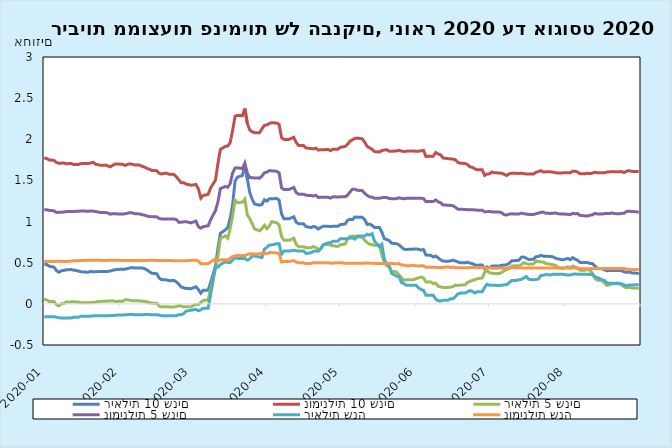
| Category | ריאלית 10 שנים | נומינלית 10 שנים | ריאלית 5 שנים | נומינלית 5 שנים | ריאלית שנה | נומינלית שנה |
|---|---|---|---|---|---|---|
| 2020-01-01 02:00:00 | 0.48 | 1.773 | 0.054 | 1.144 | -0.156 | 0.519 |
| 2020-01-02 02:00:00 | 0.478 | 1.766 | 0.048 | 1.144 | -0.156 | 0.515 |
| 2020-01-03 02:00:00 | 0.458 | 1.749 | 0.03 | 1.136 | -0.156 | 0.515 |
| 2020-01-05 02:00:00 | 0.446 | 1.743 | 0.03 | 1.13 | -0.156 | 0.515 |
| 2020-01-06 02:00:00 | 0.405 | 1.717 | -0.01 | 1.11 | -0.163 | 0.517 |
| 2020-01-07 02:00:00 | 0.384 | 1.708 | -0.024 | 1.113 | -0.168 | 0.517 |
| 2020-01-08 02:00:00 | 0.402 | 1.71 | 0.002 | 1.114 | -0.173 | 0.517 |
| 2020-01-09 02:00:00 | 0.405 | 1.712 | 0.003 | 1.116 | -0.173 | 0.515 |
| 2020-01-10 02:00:00 | 0.414 | 1.703 | 0.024 | 1.121 | -0.171 | 0.515 |
| 2020-01-12 02:00:00 | 0.418 | 1.705 | 0.024 | 1.123 | -0.171 | 0.519 |
| 2020-01-13 02:00:00 | 0.41 | 1.694 | 0.027 | 1.122 | -0.163 | 0.525 |
| 2020-01-14 02:00:00 | 0.406 | 1.695 | 0.023 | 1.126 | -0.163 | 0.525 |
| 2020-01-15 02:00:00 | 0.398 | 1.695 | 0.02 | 1.125 | -0.163 | 0.525 |
| 2020-01-16 02:00:00 | 0.39 | 1.704 | 0.017 | 1.128 | -0.151 | 0.527 |
| 2020-01-17 02:00:00 | 0.387 | 1.707 | 0.012 | 1.128 | -0.151 | 0.527 |
| 2020-01-19 02:00:00 | 0.385 | 1.707 | 0.012 | 1.126 | -0.151 | 0.529 |
| 2020-01-20 02:00:00 | 0.395 | 1.712 | 0.017 | 1.128 | -0.151 | 0.529 |
| 2020-01-21 02:00:00 | 0.389 | 1.721 | 0.017 | 1.126 | -0.146 | 0.531 |
| 2020-01-22 02:00:00 | 0.391 | 1.697 | 0.021 | 1.123 | -0.146 | 0.529 |
| 2020-01-23 02:00:00 | 0.392 | 1.691 | 0.028 | 1.116 | -0.146 | 0.529 |
| 2020-01-24 02:00:00 | 0.392 | 1.684 | 0.03 | 1.109 | -0.146 | 0.529 |
| 2020-01-26 02:00:00 | 0.394 | 1.686 | 0.03 | 1.109 | -0.146 | 0.527 |
| 2020-01-27 02:00:00 | 0.395 | 1.676 | 0.036 | 1.105 | -0.146 | 0.529 |
| 2020-01-28 02:00:00 | 0.4 | 1.665 | 0.035 | 1.09 | -0.14 | 0.531 |
| 2020-01-29 02:00:00 | 0.408 | 1.683 | 0.038 | 1.095 | -0.14 | 0.529 |
| 2020-01-30 02:00:00 | 0.415 | 1.699 | 0.029 | 1.096 | -0.14 | 0.529 |
| 2020-01-31 02:00:00 | 0.418 | 1.699 | 0.031 | 1.092 | -0.135 | 0.529 |
| 2020-02-02 02:00:00 | 0.422 | 1.697 | 0.031 | 1.09 | -0.135 | 0.527 |
| 2020-02-03 02:00:00 | 0.422 | 1.683 | 0.049 | 1.095 | -0.133 | 0.527 |
| 2020-02-04 02:00:00 | 0.427 | 1.694 | 0.049 | 1.1 | -0.133 | 0.527 |
| 2020-02-05 02:00:00 | 0.437 | 1.702 | 0.045 | 1.109 | -0.128 | 0.527 |
| 2020-02-06 02:00:00 | 0.439 | 1.696 | 0.037 | 1.105 | -0.128 | 0.527 |
| 2020-02-07 02:00:00 | 0.436 | 1.689 | 0.037 | 1.097 | -0.133 | 0.527 |
| 2020-02-09 02:00:00 | 0.434 | 1.687 | 0.037 | 1.093 | -0.133 | 0.525 |
| 2020-02-10 02:00:00 | 0.437 | 1.671 | 0.03 | 1.084 | -0.133 | 0.529 |
| 2020-02-11 02:00:00 | 0.428 | 1.662 | 0.031 | 1.078 | -0.131 | 0.527 |
| 2020-02-12 02:00:00 | 0.413 | 1.645 | 0.025 | 1.067 | -0.131 | 0.527 |
| 2020-02-13 02:00:00 | 0.391 | 1.635 | 0.015 | 1.061 | -0.131 | 0.529 |
| 2020-02-14 02:00:00 | 0.372 | 1.621 | 0.008 | 1.06 | -0.133 | 0.529 |
| 2020-02-16 02:00:00 | 0.366 | 1.619 | 0.008 | 1.058 | -0.133 | 0.527 |
| 2020-02-17 02:00:00 | 0.314 | 1.586 | -0.028 | 1.038 | -0.136 | 0.527 |
| 2020-02-18 02:00:00 | 0.292 | 1.578 | -0.038 | 1.031 | -0.146 | 0.527 |
| 2020-02-19 02:00:00 | 0.294 | 1.586 | -0.035 | 1.03 | -0.146 | 0.525 |
| 2020-02-20 02:00:00 | 0.291 | 1.587 | -0.034 | 1.03 | -0.146 | 0.527 |
| 2020-02-21 02:00:00 | 0.282 | 1.575 | -0.037 | 1.031 | -0.143 | 0.527 |
| 2020-02-23 02:00:00 | 0.284 | 1.573 | -0.037 | 1.031 | -0.143 | 0.525 |
| 2020-02-24 02:00:00 | 0.268 | 1.544 | -0.033 | 1.024 | -0.143 | 0.525 |
| 2020-02-25 02:00:00 | 0.239 | 1.508 | -0.023 | 0.992 | -0.132 | 0.525 |
| 2020-02-26 02:00:00 | 0.204 | 1.471 | -0.027 | 0.992 | -0.132 | 0.525 |
| 2020-02-27 02:00:00 | 0.196 | 1.473 | -0.038 | 0.996 | -0.119 | 0.525 |
| 2020-02-28 02:00:00 | 0.187 | 1.456 | -0.034 | 0.998 | -0.089 | 0.525 |
| 2020-03-01 02:00:00 | 0.185 | 1.442 | -0.034 | 0.984 | -0.077 | 0.529 |
| 2020-03-03 02:00:00 | 0.208 | 1.45 | -0.007 | 1.006 | -0.067 | 0.531 |
| 2020-03-04 02:00:00 | 0.174 | 1.399 | -0.01 | 0.938 | -0.084 | 0.519 |
| 2020-03-05 02:00:00 | 0.129 | 1.284 | 0.018 | 0.919 | -0.073 | 0.487 |
| 2020-03-06 02:00:00 | 0.165 | 1.317 | 0.043 | 0.939 | -0.052 | 0.487 |
| 2020-03-08 02:00:00 | 0.166 | 1.331 | 0.043 | 0.949 | -0.052 | 0.487 |
| 2020-03-09 02:00:00 | 0.257 | 1.409 | 0.18 | 1.021 | 0.107 | 0.51 |
| 2020-03-11 02:00:00 | 0.458 | 1.503 | 0.429 | 1.134 | 0.459 | 0.544 |
| 2020-03-12 02:00:00 | 0.673 | 1.707 | 0.579 | 1.239 | 0.448 | 0.524 |
| 2020-03-13 02:00:00 | 0.857 | 1.877 | 0.796 | 1.402 | 0.478 | 0.534 |
| 2020-03-15 02:00:00 | 0.898 | 1.913 | 0.827 | 1.426 | 0.512 | 0.538 |
| 2020-03-16 02:00:00 | 0.929 | 1.918 | 0.799 | 1.416 | 0.502 | 0.526 |
| 2020-03-17 02:00:00 | 1.035 | 1.958 | 0.916 | 1.463 | 0.502 | 0.556 |
| 2020-03-18 02:00:00 | 1.206 | 2.107 | 1.072 | 1.591 | 0.532 | 0.576 |
| 2020-03-19 02:00:00 | 1.493 | 2.28 | 1.26 | 1.651 | 0.562 | 0.58 |
| 2020-03-20 02:00:00 | 1.541 | 2.29 | 1.229 | 1.653 | 0.552 | 0.59 |
| 2020-03-22 02:00:00 | 1.559 | 2.286 | 1.237 | 1.643 | 0.552 | 0.588 |
| 2020-03-23 02:00:00 | 1.685 | 2.374 | 1.273 | 1.711 | 0.552 | 0.586 |
| 2020-03-24 02:00:00 | 1.52 | 2.192 | 1.082 | 1.587 | 0.532 | 0.6 |
| 2020-03-25 02:00:00 | 1.353 | 2.115 | 1.037 | 1.536 | 0.547 | 0.609 |
| 2020-03-26 02:00:00 | 1.268 | 2.09 | 0.974 | 1.533 | 0.581 | 0.605 |
| 2020-03-27 03:00:00 | 1.213 | 2.08 | 0.91 | 1.53 | 0.581 | 0.605 |
| 2020-03-29 03:00:00 | 1.199 | 2.08 | 0.888 | 1.528 | 0.569 | 0.609 |
| 2020-03-30 03:00:00 | 1.207 | 2.128 | 0.914 | 1.553 | 0.563 | 0.613 |
| 2020-03-31 03:00:00 | 1.266 | 2.169 | 0.955 | 1.594 | 0.666 | 0.611 |
| 2020-04-01 03:00:00 | 1.249 | 2.174 | 0.915 | 1.601 | 0.686 | 0.609 |
| 2020-04-02 03:00:00 | 1.277 | 2.193 | 0.945 | 1.62 | 0.716 | 0.623 |
| 2020-04-03 03:00:00 | 1.278 | 2.202 | 0.999 | 1.616 | 0.716 | 0.623 |
| 2020-04-05 03:00:00 | 1.28 | 2.198 | 0.985 | 1.612 | 0.731 | 0.619 |
| 2020-04-06 03:00:00 | 1.261 | 2.181 | 0.956 | 1.592 | 0.731 | 0.613 |
| 2020-04-07 03:00:00 | 1.093 | 2.019 | 0.817 | 1.41 | 0.605 | 0.509 |
| 2020-04-08 03:00:00 | 1.033 | 1.999 | 0.772 | 1.39 | 0.641 | 0.515 |
| 2020-04-10 03:00:00 | 1.033 | 1.999 | 0.772 | 1.39 | 0.641 | 0.515 |
| 2020-04-12 03:00:00 | 1.058 | 2.024 | 0.797 | 1.415 | 0.651 | 0.525 |
| 2020-04-13 03:00:00 | 0.992 | 1.96 | 0.721 | 1.352 | 0.645 | 0.507 |
| 2020-04-14 03:00:00 | 0.972 | 1.924 | 0.695 | 1.333 | 0.641 | 0.499 |
| 2020-04-16 03:00:00 | 0.972 | 1.924 | 0.695 | 1.333 | 0.641 | 0.499 |
| 2020-04-17 03:00:00 | 0.939 | 1.895 | 0.681 | 1.319 | 0.611 | 0.489 |
| 2020-04-19 03:00:00 | 0.927 | 1.887 | 0.683 | 1.317 | 0.621 | 0.489 |
| 2020-04-20 03:00:00 | 0.942 | 1.885 | 0.697 | 1.311 | 0.637 | 0.501 |
| 2020-04-21 03:00:00 | 0.935 | 1.893 | 0.684 | 1.32 | 0.641 | 0.499 |
| 2020-04-22 03:00:00 | 0.909 | 1.869 | 0.662 | 1.292 | 0.639 | 0.501 |
| 2020-04-23 03:00:00 | 0.928 | 1.873 | 0.671 | 1.297 | 0.667 | 0.501 |
| 2020-04-24 03:00:00 | 0.944 | 1.874 | 0.714 | 1.296 | 0.717 | 0.501 |
| 2020-04-26 03:00:00 | 0.944 | 1.876 | 0.724 | 1.296 | 0.741 | 0.499 |
| 2020-04-27 03:00:00 | 0.938 | 1.863 | 0.713 | 1.285 | 0.741 | 0.495 |
| 2020-04-28 03:00:00 | 0.944 | 1.879 | 0.706 | 1.301 | 0.761 | 0.495 |
| 2020-04-30 03:00:00 | 0.942 | 1.879 | 0.698 | 1.299 | 0.761 | 0.499 |
| 2020-05-01 03:00:00 | 0.963 | 1.902 | 0.717 | 1.3 | 0.792 | 0.499 |
| 2020-05-03 03:00:00 | 0.971 | 1.914 | 0.727 | 1.3 | 0.792 | 0.493 |
| 2020-05-04 03:00:00 | 1.017 | 1.94 | 0.79 | 1.322 | 0.792 | 0.493 |
| 2020-05-05 03:00:00 | 1.027 | 1.978 | 0.819 | 1.361 | 0.802 | 0.493 |
| 2020-05-06 03:00:00 | 1.025 | 1.994 | 0.824 | 1.393 | 0.802 | 0.493 |
| 2020-05-07 03:00:00 | 1.056 | 2.011 | 0.823 | 1.393 | 0.788 | 0.492 |
| 2020-05-08 03:00:00 | 1.053 | 2.014 | 0.814 | 1.38 | 0.824 | 0.492 |
| 2020-05-10 03:00:00 | 1.053 | 2.006 | 0.81 | 1.376 | 0.824 | 0.492 |
| 2020-05-11 03:00:00 | 1.022 | 1.964 | 0.773 | 1.344 | 0.824 | 0.492 |
| 2020-05-12 03:00:00 | 0.965 | 1.913 | 0.744 | 1.317 | 0.846 | 0.498 |
| 2020-05-13 03:00:00 | 0.969 | 1.896 | 0.724 | 1.301 | 0.836 | 0.494 |
| 2020-05-14 03:00:00 | 0.955 | 1.878 | 0.721 | 1.295 | 0.852 | 0.492 |
| 2020-05-15 03:00:00 | 0.927 | 1.85 | 0.71 | 1.284 | 0.762 | 0.492 |
| 2020-05-17 03:00:00 | 0.927 | 1.846 | 0.716 | 1.282 | 0.692 | 0.49 |
| 2020-05-18 03:00:00 | 0.871 | 1.864 | 0.594 | 1.291 | 0.722 | 0.49 |
| 2020-05-19 03:00:00 | 0.791 | 1.869 | 0.508 | 1.292 | 0.541 | 0.49 |
| 2020-05-20 03:00:00 | 0.781 | 1.873 | 0.464 | 1.292 | 0.487 | 0.49 |
| 2020-05-21 03:00:00 | 0.768 | 1.856 | 0.448 | 1.28 | 0.457 | 0.49 |
| 2020-05-22 03:00:00 | 0.737 | 1.855 | 0.397 | 1.279 | 0.371 | 0.49 |
| 2020-05-24 03:00:00 | 0.731 | 1.857 | 0.388 | 1.279 | 0.337 | 0.488 |
| 2020-05-25 03:00:00 | 0.718 | 1.867 | 0.354 | 1.289 | 0.332 | 0.488 |
| 2020-05-26 03:00:00 | 0.69 | 1.857 | 0.315 | 1.282 | 0.26 | 0.472 |
| 2020-05-27 03:00:00 | 0.665 | 1.851 | 0.286 | 1.277 | 0.246 | 0.472 |
| 2020-05-28 03:00:00 | 0.661 | 1.856 | 0.294 | 1.283 | 0.226 | 0.462 |
| 2020-05-31 03:00:00 | 0.665 | 1.858 | 0.294 | 1.285 | 0.226 | 0.466 |
| 2020-06-01 03:00:00 | 0.666 | 1.853 | 0.307 | 1.282 | 0.226 | 0.462 |
| 2020-06-02 03:00:00 | 0.663 | 1.856 | 0.316 | 1.282 | 0.196 | 0.46 |
| 2020-06-03 03:00:00 | 0.653 | 1.859 | 0.326 | 1.284 | 0.174 | 0.462 |
| 2020-06-04 03:00:00 | 0.661 | 1.866 | 0.317 | 1.28 | 0.166 | 0.464 |
| 2020-06-05 03:00:00 | 0.594 | 1.791 | 0.267 | 1.242 | 0.106 | 0.444 |
| 2020-06-07 03:00:00 | 0.59 | 1.795 | 0.267 | 1.244 | 0.106 | 0.446 |
| 2020-06-08 03:00:00 | 0.57 | 1.795 | 0.247 | 1.244 | 0.106 | 0.446 |
| 2020-06-09 03:00:00 | 0.581 | 1.839 | 0.252 | 1.262 | 0.059 | 0.442 |
| 2020-06-10 03:00:00 | 0.559 | 1.821 | 0.214 | 1.24 | 0.039 | 0.442 |
| 2020-06-11 03:00:00 | 0.535 | 1.811 | 0.207 | 1.23 | 0.034 | 0.442 |
| 2020-06-12 03:00:00 | 0.52 | 1.773 | 0.198 | 1.202 | 0.044 | 0.442 |
| 2020-06-14 03:00:00 | 0.518 | 1.765 | 0.198 | 1.198 | 0.044 | 0.45 |
| 2020-06-15 03:00:00 | 0.522 | 1.762 | 0.203 | 1.196 | 0.061 | 0.442 |
| 2020-06-16 03:00:00 | 0.531 | 1.759 | 0.209 | 1.193 | 0.061 | 0.448 |
| 2020-06-17 03:00:00 | 0.522 | 1.753 | 0.229 | 1.174 | 0.087 | 0.44 |
| 2020-06-18 03:00:00 | 0.511 | 1.721 | 0.221 | 1.151 | 0.119 | 0.44 |
| 2020-06-19 03:00:00 | 0.5 | 1.708 | 0.23 | 1.15 | 0.131 | 0.44 |
| 2020-06-21 03:00:00 | 0.498 | 1.706 | 0.23 | 1.148 | 0.131 | 0.44 |
| 2020-06-22 03:00:00 | 0.507 | 1.692 | 0.259 | 1.144 | 0.146 | 0.44 |
| 2020-06-23 03:00:00 | 0.494 | 1.665 | 0.274 | 1.144 | 0.162 | 0.44 |
| 2020-06-24 03:00:00 | 0.491 | 1.659 | 0.285 | 1.144 | 0.152 | 0.442 |
| 2020-06-25 03:00:00 | 0.472 | 1.64 | 0.293 | 1.141 | 0.132 | 0.44 |
| 2020-06-26 03:00:00 | 0.47 | 1.63 | 0.306 | 1.138 | 0.146 | 0.44 |
| 2020-06-28 03:00:00 | 0.472 | 1.63 | 0.314 | 1.138 | 0.147 | 0.442 |
| 2020-06-29 03:00:00 | 0.427 | 1.562 | 0.382 | 1.118 | 0.2 | 0.435 |
| 2020-06-30 03:00:00 | 0.449 | 1.579 | 0.4 | 1.121 | 0.239 | 0.433 |
| 2020-07-01 03:00:00 | 0.439 | 1.58 | 0.378 | 1.121 | 0.227 | 0.441 |
| 2020-07-02 03:00:00 | 0.459 | 1.602 | 0.371 | 1.119 | 0.227 | 0.433 |
| 2020-07-03 03:00:00 | 0.459 | 1.593 | 0.37 | 1.115 | 0.227 | 0.433 |
| 2020-07-05 03:00:00 | 0.459 | 1.591 | 0.368 | 1.115 | 0.221 | 0.435 |
| 2020-07-06 03:00:00 | 0.469 | 1.587 | 0.383 | 1.106 | 0.227 | 0.437 |
| 2020-07-07 03:00:00 | 0.471 | 1.574 | 0.403 | 1.083 | 0.231 | 0.433 |
| 2020-07-08 03:00:00 | 0.476 | 1.56 | 0.417 | 1.079 | 0.233 | 0.435 |
| 2020-07-09 03:00:00 | 0.492 | 1.58 | 0.427 | 1.091 | 0.257 | 0.439 |
| 2020-07-10 03:00:00 | 0.523 | 1.588 | 0.46 | 1.094 | 0.283 | 0.439 |
| 2020-07-12 03:00:00 | 0.527 | 1.586 | 0.464 | 1.092 | 0.285 | 0.437 |
| 2020-07-13 03:00:00 | 0.53 | 1.585 | 0.457 | 1.091 | 0.293 | 0.439 |
| 2020-07-14 03:00:00 | 0.567 | 1.589 | 0.478 | 1.102 | 0.297 | 0.437 |
| 2020-07-15 03:00:00 | 0.569 | 1.582 | 0.501 | 1.096 | 0.315 | 0.437 |
| 2020-07-16 03:00:00 | 0.555 | 1.58 | 0.49 | 1.091 | 0.333 | 0.437 |
| 2020-07-17 03:00:00 | 0.538 | 1.578 | 0.482 | 1.087 | 0.299 | 0.437 |
| 2020-07-19 03:00:00 | 0.542 | 1.578 | 0.486 | 1.085 | 0.293 | 0.437 |
| 2020-07-20 03:00:00 | 0.573 | 1.599 | 0.52 | 1.096 | 0.297 | 0.437 |
| 2020-07-21 03:00:00 | 0.577 | 1.608 | 0.515 | 1.102 | 0.303 | 0.435 |
| 2020-07-22 03:00:00 | 0.59 | 1.619 | 0.509 | 1.113 | 0.345 | 0.435 |
| 2020-07-23 03:00:00 | 0.579 | 1.601 | 0.51 | 1.115 | 0.347 | 0.435 |
| 2020-07-24 03:00:00 | 0.578 | 1.604 | 0.489 | 1.101 | 0.357 | 0.435 |
| 2020-07-26 03:00:00 | 0.576 | 1.604 | 0.481 | 1.099 | 0.351 | 0.435 |
| 2020-07-27 03:00:00 | 0.57 | 1.601 | 0.475 | 1.102 | 0.361 | 0.437 |
| 2020-07-28 03:00:00 | 0.554 | 1.593 | 0.468 | 1.104 | 0.361 | 0.437 |
| 2020-07-29 03:00:00 | 0.546 | 1.59 | 0.441 | 1.094 | 0.359 | 0.435 |
| 2020-07-31 03:00:00 | 0.536 | 1.592 | 0.43 | 1.091 | 0.359 | 0.435 |
| 2020-08-02 03:00:00 | 0.552 | 1.594 | 0.45 | 1.089 | 0.351 | 0.435 |
| 2020-08-03 03:00:00 | 0.537 | 1.592 | 0.438 | 1.084 | 0.351 | 0.433 |
| 2020-08-04 03:00:00 | 0.561 | 1.613 | 0.458 | 1.101 | 0.361 | 0.435 |
| 2020-08-05 03:00:00 | 0.544 | 1.612 | 0.447 | 1.093 | 0.363 | 0.437 |
| 2020-08-06 03:00:00 | 0.529 | 1.6 | 0.43 | 1.098 | 0.361 | 0.437 |
| 2020-08-07 03:00:00 | 0.504 | 1.581 | 0.41 | 1.075 | 0.361 | 0.427 |
| 2020-08-09 03:00:00 | 0.502 | 1.581 | 0.408 | 1.069 | 0.359 | 0.427 |
| 2020-08-10 03:00:00 | 0.504 | 1.589 | 0.422 | 1.069 | 0.361 | 0.427 |
| 2020-08-11 03:00:00 | 0.491 | 1.582 | 0.405 | 1.076 | 0.357 | 0.427 |
| 2020-08-12 03:00:00 | 0.491 | 1.588 | 0.375 | 1.081 | 0.357 | 0.427 |
| 2020-08-13 03:00:00 | 0.462 | 1.599 | 0.314 | 1.099 | 0.331 | 0.429 |
| 2020-08-14 03:00:00 | 0.433 | 1.594 | 0.287 | 1.093 | 0.321 | 0.429 |
| 2020-08-16 03:00:00 | 0.427 | 1.592 | 0.283 | 1.091 | 0.293 | 0.429 |
| 2020-08-17 03:00:00 | 0.414 | 1.594 | 0.251 | 1.097 | 0.283 | 0.429 |
| 2020-08-18 03:00:00 | 0.402 | 1.601 | 0.224 | 1.099 | 0.253 | 0.429 |
| 2020-08-19 03:00:00 | 0.407 | 1.604 | 0.231 | 1.097 | 0.251 | 0.429 |
| 2020-08-20 03:00:00 | 0.407 | 1.606 | 0.243 | 1.105 | 0.251 | 0.429 |
| 2020-08-21 03:00:00 | 0.405 | 1.605 | 0.244 | 1.097 | 0.251 | 0.429 |
| 2020-08-23 03:00:00 | 0.405 | 1.605 | 0.244 | 1.093 | 0.251 | 0.429 |
| 2020-08-24 03:00:00 | 0.404 | 1.608 | 0.231 | 1.1 | 0.243 | 0.429 |
| 2020-08-25 03:00:00 | 0.389 | 1.596 | 0.208 | 1.1 | 0.23 | 0.431 |
| 2020-08-26 03:00:00 | 0.383 | 1.612 | 0.196 | 1.122 | 0.22 | 0.421 |
| 2020-08-27 03:00:00 | 0.388 | 1.619 | 0.201 | 1.126 | 0.23 | 0.419 |
| 2020-08-28 03:00:00 | 0.377 | 1.61 | 0.195 | 1.123 | 0.23 | 0.419 |
| 2020-08-30 03:00:00 | 0.373 | 1.608 | 0.191 | 1.119 | 0.233 | 0.419 |
| 2020-08-31 03:00:00 | 0.366 | 1.609 | 0.188 | 1.113 | 0.232 | 0.419 |